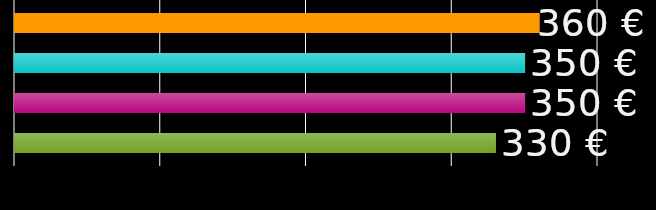
| Category | compañero de piso 1 | compañero de piso 2 | compañero de piso 3 | compañero de piso 4 |
|---|---|---|---|---|
| 0 | 360 | 350 | 350 | 330 |